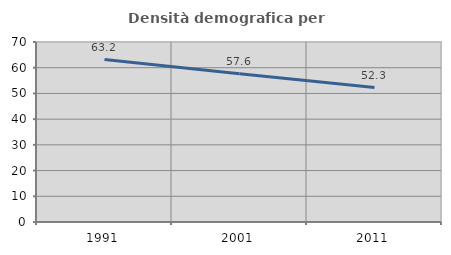
| Category | Densità demografica |
|---|---|
| 1991.0 | 63.181 |
| 2001.0 | 57.621 |
| 2011.0 | 52.301 |